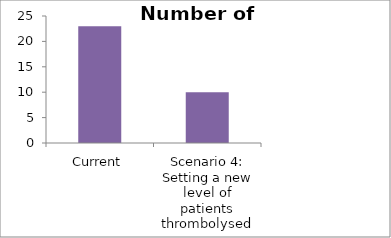
| Category | Number of patients thrombolysed |
|---|---|
| Current | 23 |
| Scenario 4: Setting a new level of patients thrombolysed | 10 |